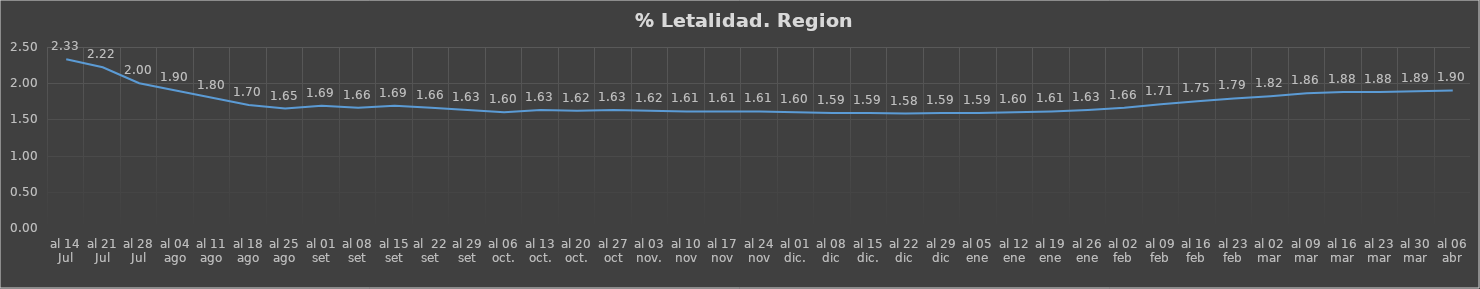
| Category | Series 0 |
|---|---|
| al 14 Jul | 2.33 |
| al 21 Jul | 2.22 |
| al 28 Jul | 2 |
| al 04 ago | 1.9 |
| al 11 ago | 1.8 |
| al 18 ago | 1.7 |
| al 25 ago | 1.65 |
| al 01 set | 1.69 |
| al 08 set | 1.66 |
| al 15 set | 1.69 |
| al  22 set | 1.66 |
| al 29 set | 1.63 |
| al 06 oct. | 1.6 |
| al 13 oct. | 1.63 |
| al 20 oct. | 1.62 |
| al 27 oct | 1.63 |
| al 03 nov. | 1.62 |
| al 10 nov | 1.61 |
| al 17 nov | 1.61 |
| al 24 nov | 1.61 |
| al 01 dic. | 1.6 |
| al 08 dic | 1.59 |
| al 15 dic. | 1.59 |
| al 22 dic | 1.58 |
| al 29 dic | 1.59 |
| al 05 ene | 1.59 |
| al 12 ene | 1.6 |
| al 19 ene | 1.61 |
| al 26 ene | 1.63 |
| al 02 feb | 1.66 |
| al 09 feb | 1.71 |
| al 16 feb | 1.75 |
| al 23 feb | 1.79 |
| al 02 mar | 1.82 |
| al 09 mar | 1.86 |
| al 16 mar | 1.88 |
| al 23 mar | 1.88 |
| al 30 mar | 1.89 |
| al 06 abr | 1.9 |